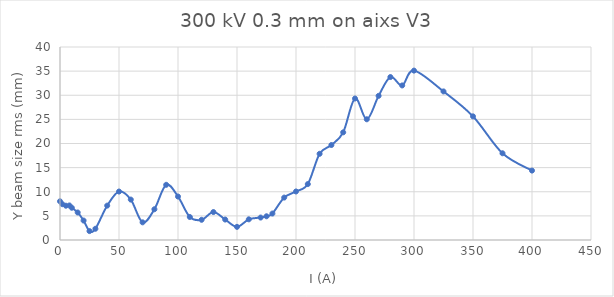
| Category | Series 0 |
|---|---|
| 0.0 | 8.023 |
| 2.0 | 7.421 |
| 5.0 | 7.107 |
| 8.0 | 7.16 |
| 10.0 | 6.685 |
| 15.0 | 5.701 |
| 20.0 | 4.031 |
| 25.0 | 1.846 |
| 30.0 | 2.329 |
| 40.0 | 7.124 |
| 50.0 | 10.045 |
| 60.0 | 8.378 |
| 70.0 | 3.662 |
| 80.0 | 6.371 |
| 90.0 | 11.439 |
| 100.0 | 9.009 |
| 110.0 | 4.773 |
| 120.0 | 4.189 |
| 130.0 | 5.794 |
| 140.0 | 4.24 |
| 150.0 | 2.724 |
| 160.0 | 4.286 |
| 170.0 | 4.653 |
| 175.0 | 4.916 |
| 180.0 | 5.484 |
| 190.0 | 8.793 |
| 200.0 | 10.057 |
| 210.0 | 11.587 |
| 220.0 | 17.863 |
| 230.0 | 19.685 |
| 240.0 | 22.314 |
| 250.0 | 29.325 |
| 260.0 | 25.019 |
| 270.0 | 29.876 |
| 280.0 | 33.773 |
| 290.0 | 32.031 |
| 300.0 | 35.109 |
| 325.0 | 30.792 |
| 350.0 | 25.622 |
| 375.0 | 17.973 |
| 400.0 | 14.389 |